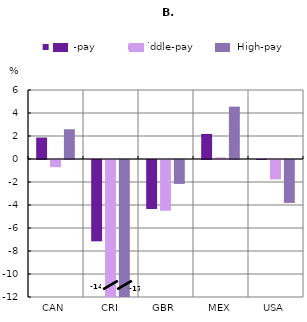
| Category | Low-pay | Middle-pay | High-pay |
|---|---|---|---|
| CAN | 1.865 | -0.624 | 2.587 |
| CRI | -7.072 | -14.433 | -17.022 |
| GBR | -4.259 | -4.412 | -2.079 |
| MEX | 2.179 | 0.136 | 4.552 |
| USA | 0.009 | -1.688 | -3.733 |